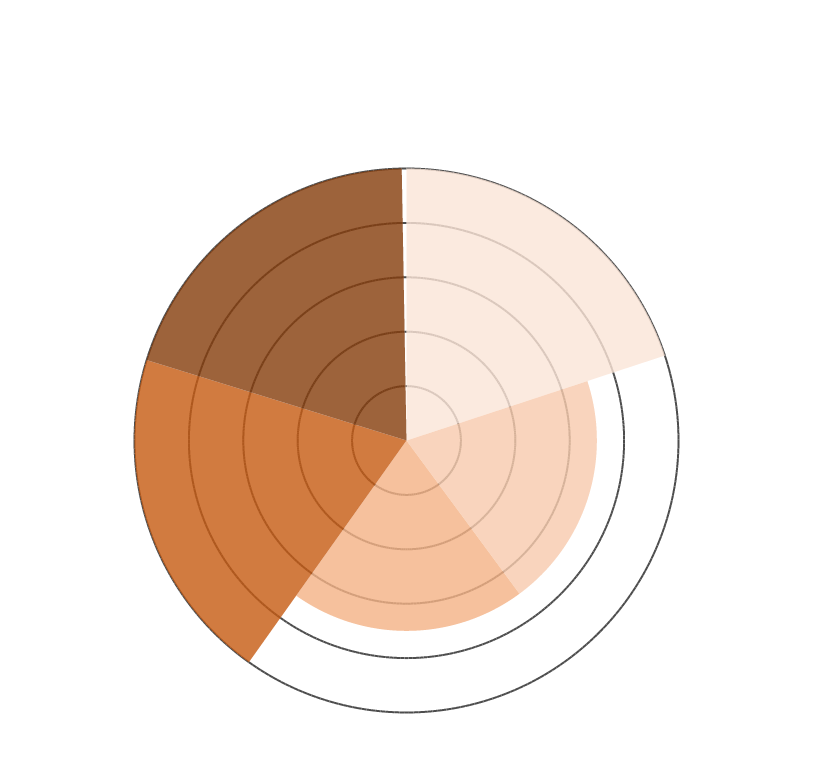
| Category | WKK / Biogasketel | Warmtevraag slibvergisting | Vollasturen WKK | Aquathermie? | Uitkoppeling gerealiseerd? |
|---|---|---|---|---|---|
| 0 | 10 | 0 | 0 | 0 | 0 |
| 1 | 10 | 0 | 0 | 0 | 0 |
| 2 | 10 | 0 | 0 | 0 | 0 |
| 3 | 10 | 0 | 0 | 0 | 0 |
| 4 | 10 | 0 | 0 | 0 | 0 |
| 5 | 10 | 0 | 0 | 0 | 0 |
| 6 | 10 | 0 | 0 | 0 | 0 |
| 7 | 10 | 0 | 0 | 0 | 0 |
| 8 | 10 | 0 | 0 | 0 | 0 |
| 9 | 10 | 0 | 0 | 0 | 0 |
| 10 | 10 | 0 | 0 | 0 | 0 |
| 11 | 10 | 0 | 0 | 0 | 0 |
| 12 | 10 | 0 | 0 | 0 | 0 |
| 13 | 10 | 0 | 0 | 0 | 0 |
| 14 | 10 | 0 | 0 | 0 | 0 |
| 15 | 10 | 0 | 0 | 0 | 0 |
| 16 | 10 | 0 | 0 | 0 | 0 |
| 17 | 10 | 0 | 0 | 0 | 0 |
| 18 | 10 | 0 | 0 | 0 | 0 |
| 19 | 10 | 0 | 0 | 0 | 0 |
| 20 | 10 | 0 | 0 | 0 | 0 |
| 21 | 10 | 0 | 0 | 0 | 0 |
| 22 | 10 | 0 | 0 | 0 | 0 |
| 23 | 10 | 0 | 0 | 0 | 0 |
| 24 | 10 | 0 | 0 | 0 | 0 |
| 25 | 10 | 0 | 0 | 0 | 0 |
| 26 | 10 | 0 | 0 | 0 | 0 |
| 27 | 10 | 0 | 0 | 0 | 0 |
| 28 | 10 | 0 | 0 | 0 | 0 |
| 29 | 10 | 0 | 0 | 0 | 0 |
| 30 | 10 | 0 | 0 | 0 | 0 |
| 31 | 10 | 0 | 0 | 0 | 0 |
| 32 | 10 | 0 | 0 | 0 | 0 |
| 33 | 10 | 0 | 0 | 0 | 0 |
| 34 | 10 | 0 | 0 | 0 | 0 |
| 35 | 10 | 0 | 0 | 0 | 0 |
| 36 | 10 | 0 | 0 | 0 | 0 |
| 37 | 10 | 0 | 0 | 0 | 0 |
| 38 | 10 | 0 | 0 | 0 | 0 |
| 39 | 10 | 0 | 0 | 0 | 0 |
| 40 | 10 | 0 | 0 | 0 | 0 |
| 41 | 10 | 0 | 0 | 0 | 0 |
| 42 | 10 | 0 | 0 | 0 | 0 |
| 43 | 10 | 0 | 0 | 0 | 0 |
| 44 | 10 | 0 | 0 | 0 | 0 |
| 45 | 10 | 0 | 0 | 0 | 0 |
| 46 | 10 | 0 | 0 | 0 | 0 |
| 47 | 10 | 0 | 0 | 0 | 0 |
| 48 | 10 | 0 | 0 | 0 | 0 |
| 49 | 10 | 0 | 0 | 0 | 0 |
| 50 | 10 | 0 | 0 | 0 | 0 |
| 51 | 10 | 0 | 0 | 0 | 0 |
| 52 | 10 | 0 | 0 | 0 | 0 |
| 53 | 10 | 0 | 0 | 0 | 0 |
| 54 | 10 | 0 | 0 | 0 | 0 |
| 55 | 10 | 0 | 0 | 0 | 0 |
| 56 | 10 | 0 | 0 | 0 | 0 |
| 57 | 10 | 0 | 0 | 0 | 0 |
| 58 | 10 | 0 | 0 | 0 | 0 |
| 59 | 10 | 0 | 0 | 0 | 0 |
| 60 | 10 | 0 | 0 | 0 | 0 |
| 61 | 10 | 0 | 0 | 0 | 0 |
| 62 | 10 | 0 | 0 | 0 | 0 |
| 63 | 10 | 0 | 0 | 0 | 0 |
| 64 | 10 | 0 | 0 | 0 | 0 |
| 65 | 10 | 0 | 0 | 0 | 0 |
| 66 | 10 | 0 | 0 | 0 | 0 |
| 67 | 10 | 0 | 0 | 0 | 0 |
| 68 | 10 | 0 | 0 | 0 | 0 |
| 69 | 10 | 0 | 0 | 0 | 0 |
| 70 | 10 | 0 | 0 | 0 | 0 |
| 71 | 10 | 0 | 0 | 0 | 0 |
| 72 | 10 | 7 | 0 | 0 | 0 |
| 73 | 0 | 7 | 0 | 0 | 0 |
| 74 | 0 | 7 | 0 | 0 | 0 |
| 75 | 0 | 7 | 0 | 0 | 0 |
| 76 | 0 | 7 | 0 | 0 | 0 |
| 77 | 0 | 7 | 0 | 0 | 0 |
| 78 | 0 | 7 | 0 | 0 | 0 |
| 79 | 0 | 7 | 0 | 0 | 0 |
| 80 | 0 | 7 | 0 | 0 | 0 |
| 81 | 0 | 7 | 0 | 0 | 0 |
| 82 | 0 | 7 | 0 | 0 | 0 |
| 83 | 0 | 7 | 0 | 0 | 0 |
| 84 | 0 | 7 | 0 | 0 | 0 |
| 85 | 0 | 7 | 0 | 0 | 0 |
| 86 | 0 | 7 | 0 | 0 | 0 |
| 87 | 0 | 7 | 0 | 0 | 0 |
| 88 | 0 | 7 | 0 | 0 | 0 |
| 89 | 0 | 7 | 0 | 0 | 0 |
| 90 | 0 | 7 | 0 | 0 | 0 |
| 91 | 0 | 7 | 0 | 0 | 0 |
| 92 | 0 | 7 | 0 | 0 | 0 |
| 93 | 0 | 7 | 0 | 0 | 0 |
| 94 | 0 | 7 | 0 | 0 | 0 |
| 95 | 0 | 7 | 0 | 0 | 0 |
| 96 | 0 | 7 | 0 | 0 | 0 |
| 97 | 0 | 7 | 0 | 0 | 0 |
| 98 | 0 | 7 | 0 | 0 | 0 |
| 99 | 0 | 7 | 0 | 0 | 0 |
| 100 | 0 | 7 | 0 | 0 | 0 |
| 101 | 0 | 7 | 0 | 0 | 0 |
| 102 | 0 | 7 | 0 | 0 | 0 |
| 103 | 0 | 7 | 0 | 0 | 0 |
| 104 | 0 | 7 | 0 | 0 | 0 |
| 105 | 0 | 7 | 0 | 0 | 0 |
| 106 | 0 | 7 | 0 | 0 | 0 |
| 107 | 0 | 7 | 0 | 0 | 0 |
| 108 | 0 | 7 | 0 | 0 | 0 |
| 109 | 0 | 7 | 0 | 0 | 0 |
| 110 | 0 | 7 | 0 | 0 | 0 |
| 111 | 0 | 7 | 0 | 0 | 0 |
| 112 | 0 | 7 | 0 | 0 | 0 |
| 113 | 0 | 7 | 0 | 0 | 0 |
| 114 | 0 | 7 | 0 | 0 | 0 |
| 115 | 0 | 7 | 0 | 0 | 0 |
| 116 | 0 | 7 | 0 | 0 | 0 |
| 117 | 0 | 7 | 0 | 0 | 0 |
| 118 | 0 | 7 | 0 | 0 | 0 |
| 119 | 0 | 7 | 0 | 0 | 0 |
| 120 | 0 | 7 | 0 | 0 | 0 |
| 121 | 0 | 7 | 0 | 0 | 0 |
| 122 | 0 | 7 | 0 | 0 | 0 |
| 123 | 0 | 7 | 0 | 0 | 0 |
| 124 | 0 | 7 | 0 | 0 | 0 |
| 125 | 0 | 7 | 0 | 0 | 0 |
| 126 | 0 | 7 | 0 | 0 | 0 |
| 127 | 0 | 7 | 0 | 0 | 0 |
| 128 | 0 | 7 | 0 | 0 | 0 |
| 129 | 0 | 7 | 0 | 0 | 0 |
| 130 | 0 | 7 | 0 | 0 | 0 |
| 131 | 0 | 7 | 0 | 0 | 0 |
| 132 | 0 | 7 | 0 | 0 | 0 |
| 133 | 0 | 7 | 0 | 0 | 0 |
| 134 | 0 | 7 | 0 | 0 | 0 |
| 135 | 0 | 7 | 0 | 0 | 0 |
| 136 | 0 | 7 | 0 | 0 | 0 |
| 137 | 0 | 7 | 0 | 0 | 0 |
| 138 | 0 | 7 | 0 | 0 | 0 |
| 139 | 0 | 7 | 0 | 0 | 0 |
| 140 | 0 | 7 | 0 | 0 | 0 |
| 141 | 0 | 7 | 0 | 0 | 0 |
| 142 | 0 | 7 | 0 | 0 | 0 |
| 143 | 0 | 7 | 0 | 0 | 0 |
| 144 | 0 | 7 | 7 | 0 | 0 |
| 145 | 0 | 0 | 7 | 0 | 0 |
| 146 | 0 | 0 | 7 | 0 | 0 |
| 147 | 0 | 0 | 7 | 0 | 0 |
| 148 | 0 | 0 | 7 | 0 | 0 |
| 149 | 0 | 0 | 7 | 0 | 0 |
| 150 | 0 | 0 | 7 | 0 | 0 |
| 151 | 0 | 0 | 7 | 0 | 0 |
| 152 | 0 | 0 | 7 | 0 | 0 |
| 153 | 0 | 0 | 7 | 0 | 0 |
| 154 | 0 | 0 | 7 | 0 | 0 |
| 155 | 0 | 0 | 7 | 0 | 0 |
| 156 | 0 | 0 | 7 | 0 | 0 |
| 157 | 0 | 0 | 7 | 0 | 0 |
| 158 | 0 | 0 | 7 | 0 | 0 |
| 159 | 0 | 0 | 7 | 0 | 0 |
| 160 | 0 | 0 | 7 | 0 | 0 |
| 161 | 0 | 0 | 7 | 0 | 0 |
| 162 | 0 | 0 | 7 | 0 | 0 |
| 163 | 0 | 0 | 7 | 0 | 0 |
| 164 | 0 | 0 | 7 | 0 | 0 |
| 165 | 0 | 0 | 7 | 0 | 0 |
| 166 | 0 | 0 | 7 | 0 | 0 |
| 167 | 0 | 0 | 7 | 0 | 0 |
| 168 | 0 | 0 | 7 | 0 | 0 |
| 169 | 0 | 0 | 7 | 0 | 0 |
| 170 | 0 | 0 | 7 | 0 | 0 |
| 171 | 0 | 0 | 7 | 0 | 0 |
| 172 | 0 | 0 | 7 | 0 | 0 |
| 173 | 0 | 0 | 7 | 0 | 0 |
| 174 | 0 | 0 | 7 | 0 | 0 |
| 175 | 0 | 0 | 7 | 0 | 0 |
| 176 | 0 | 0 | 7 | 0 | 0 |
| 177 | 0 | 0 | 7 | 0 | 0 |
| 178 | 0 | 0 | 7 | 0 | 0 |
| 179 | 0 | 0 | 7 | 0 | 0 |
| 180 | 0 | 0 | 7 | 0 | 0 |
| 181 | 0 | 0 | 7 | 0 | 0 |
| 182 | 0 | 0 | 7 | 0 | 0 |
| 183 | 0 | 0 | 7 | 0 | 0 |
| 184 | 0 | 0 | 7 | 0 | 0 |
| 185 | 0 | 0 | 7 | 0 | 0 |
| 186 | 0 | 0 | 7 | 0 | 0 |
| 187 | 0 | 0 | 7 | 0 | 0 |
| 188 | 0 | 0 | 7 | 0 | 0 |
| 189 | 0 | 0 | 7 | 0 | 0 |
| 190 | 0 | 0 | 7 | 0 | 0 |
| 191 | 0 | 0 | 7 | 0 | 0 |
| 192 | 0 | 0 | 7 | 0 | 0 |
| 193 | 0 | 0 | 7 | 0 | 0 |
| 194 | 0 | 0 | 7 | 0 | 0 |
| 195 | 0 | 0 | 7 | 0 | 0 |
| 196 | 0 | 0 | 7 | 0 | 0 |
| 197 | 0 | 0 | 7 | 0 | 0 |
| 198 | 0 | 0 | 7 | 0 | 0 |
| 199 | 0 | 0 | 7 | 0 | 0 |
| 200 | 0 | 0 | 7 | 0 | 0 |
| 201 | 0 | 0 | 7 | 0 | 0 |
| 202 | 0 | 0 | 7 | 0 | 0 |
| 203 | 0 | 0 | 7 | 0 | 0 |
| 204 | 0 | 0 | 7 | 0 | 0 |
| 205 | 0 | 0 | 7 | 0 | 0 |
| 206 | 0 | 0 | 7 | 0 | 0 |
| 207 | 0 | 0 | 7 | 0 | 0 |
| 208 | 0 | 0 | 7 | 0 | 0 |
| 209 | 0 | 0 | 7 | 0 | 0 |
| 210 | 0 | 0 | 7 | 0 | 0 |
| 211 | 0 | 0 | 7 | 0 | 0 |
| 212 | 0 | 0 | 7 | 0 | 0 |
| 213 | 0 | 0 | 7 | 0 | 0 |
| 214 | 0 | 0 | 7 | 0 | 0 |
| 215 | 0 | 0 | 7 | 0 | 0 |
| 216 | 0 | 0 | 7 | 10 | 0 |
| 217 | 0 | 0 | 0 | 10 | 0 |
| 218 | 0 | 0 | 0 | 10 | 0 |
| 219 | 0 | 0 | 0 | 10 | 0 |
| 220 | 0 | 0 | 0 | 10 | 0 |
| 221 | 0 | 0 | 0 | 10 | 0 |
| 222 | 0 | 0 | 0 | 10 | 0 |
| 223 | 0 | 0 | 0 | 10 | 0 |
| 224 | 0 | 0 | 0 | 10 | 0 |
| 225 | 0 | 0 | 0 | 10 | 0 |
| 226 | 0 | 0 | 0 | 10 | 0 |
| 227 | 0 | 0 | 0 | 10 | 0 |
| 228 | 0 | 0 | 0 | 10 | 0 |
| 229 | 0 | 0 | 0 | 10 | 0 |
| 230 | 0 | 0 | 0 | 10 | 0 |
| 231 | 0 | 0 | 0 | 10 | 0 |
| 232 | 0 | 0 | 0 | 10 | 0 |
| 233 | 0 | 0 | 0 | 10 | 0 |
| 234 | 0 | 0 | 0 | 10 | 0 |
| 235 | 0 | 0 | 0 | 10 | 0 |
| 236 | 0 | 0 | 0 | 10 | 0 |
| 237 | 0 | 0 | 0 | 10 | 0 |
| 238 | 0 | 0 | 0 | 10 | 0 |
| 239 | 0 | 0 | 0 | 10 | 0 |
| 240 | 0 | 0 | 0 | 10 | 0 |
| 241 | 0 | 0 | 0 | 10 | 0 |
| 242 | 0 | 0 | 0 | 10 | 0 |
| 243 | 0 | 0 | 0 | 10 | 0 |
| 244 | 0 | 0 | 0 | 10 | 0 |
| 245 | 0 | 0 | 0 | 10 | 0 |
| 246 | 0 | 0 | 0 | 10 | 0 |
| 247 | 0 | 0 | 0 | 10 | 0 |
| 248 | 0 | 0 | 0 | 10 | 0 |
| 249 | 0 | 0 | 0 | 10 | 0 |
| 250 | 0 | 0 | 0 | 10 | 0 |
| 251 | 0 | 0 | 0 | 10 | 0 |
| 252 | 0 | 0 | 0 | 10 | 0 |
| 253 | 0 | 0 | 0 | 10 | 0 |
| 254 | 0 | 0 | 0 | 10 | 0 |
| 255 | 0 | 0 | 0 | 10 | 0 |
| 256 | 0 | 0 | 0 | 10 | 0 |
| 257 | 0 | 0 | 0 | 10 | 0 |
| 258 | 0 | 0 | 0 | 10 | 0 |
| 259 | 0 | 0 | 0 | 10 | 0 |
| 260 | 0 | 0 | 0 | 10 | 0 |
| 261 | 0 | 0 | 0 | 10 | 0 |
| 262 | 0 | 0 | 0 | 10 | 0 |
| 263 | 0 | 0 | 0 | 10 | 0 |
| 264 | 0 | 0 | 0 | 10 | 0 |
| 265 | 0 | 0 | 0 | 10 | 0 |
| 266 | 0 | 0 | 0 | 10 | 0 |
| 267 | 0 | 0 | 0 | 10 | 0 |
| 268 | 0 | 0 | 0 | 10 | 0 |
| 269 | 0 | 0 | 0 | 10 | 0 |
| 270 | 0 | 0 | 0 | 10 | 0 |
| 271 | 0 | 0 | 0 | 10 | 0 |
| 272 | 0 | 0 | 0 | 10 | 0 |
| 273 | 0 | 0 | 0 | 10 | 0 |
| 274 | 0 | 0 | 0 | 10 | 0 |
| 275 | 0 | 0 | 0 | 10 | 0 |
| 276 | 0 | 0 | 0 | 10 | 0 |
| 277 | 0 | 0 | 0 | 10 | 0 |
| 278 | 0 | 0 | 0 | 10 | 0 |
| 279 | 0 | 0 | 0 | 10 | 0 |
| 280 | 0 | 0 | 0 | 10 | 0 |
| 281 | 0 | 0 | 0 | 10 | 0 |
| 282 | 0 | 0 | 0 | 10 | 0 |
| 283 | 0 | 0 | 0 | 10 | 0 |
| 284 | 0 | 0 | 0 | 10 | 0 |
| 285 | 0 | 0 | 0 | 10 | 0 |
| 286 | 0 | 0 | 0 | 10 | 0 |
| 287 | 0 | 0 | 0 | 10 | 0 |
| 288 | 0 | 0 | 0 | 10 | 0 |
| 289 | 0 | 0 | 0 | 0 | 0 |
| 290 | 0 | 0 | 0 | 0 | 0 |
| 291 | 0 | 0 | 0 | 0 | 0 |
| 292 | 0 | 0 | 0 | 0 | 0 |
| 293 | 0 | 0 | 0 | 0 | 0 |
| 294 | 0 | 0 | 0 | 0 | 0 |
| 295 | 0 | 0 | 0 | 0 | 0 |
| 296 | 0 | 0 | 0 | 0 | 0 |
| 297 | 0 | 0 | 0 | 0 | 0 |
| 298 | 0 | 0 | 0 | 0 | 0 |
| 299 | 0 | 0 | 0 | 0 | 0 |
| 300 | 0 | 0 | 0 | 0 | 0 |
| 301 | 0 | 0 | 0 | 0 | 0 |
| 302 | 0 | 0 | 0 | 0 | 0 |
| 303 | 0 | 0 | 0 | 0 | 0 |
| 304 | 0 | 0 | 0 | 0 | 0 |
| 305 | 0 | 0 | 0 | 0 | 0 |
| 306 | 0 | 0 | 0 | 0 | 0 |
| 307 | 0 | 0 | 0 | 0 | 0 |
| 308 | 0 | 0 | 0 | 0 | 0 |
| 309 | 0 | 0 | 0 | 0 | 0 |
| 310 | 0 | 0 | 0 | 0 | 0 |
| 311 | 0 | 0 | 0 | 0 | 0 |
| 312 | 0 | 0 | 0 | 0 | 0 |
| 313 | 0 | 0 | 0 | 0 | 0 |
| 314 | 0 | 0 | 0 | 0 | 0 |
| 315 | 0 | 0 | 0 | 0 | 0 |
| 316 | 0 | 0 | 0 | 0 | 0 |
| 317 | 0 | 0 | 0 | 0 | 0 |
| 318 | 0 | 0 | 0 | 0 | 0 |
| 319 | 0 | 0 | 0 | 0 | 0 |
| 320 | 0 | 0 | 0 | 0 | 0 |
| 321 | 0 | 0 | 0 | 0 | 0 |
| 322 | 0 | 0 | 0 | 0 | 0 |
| 323 | 0 | 0 | 0 | 0 | 0 |
| 324 | 0 | 0 | 0 | 0 | 0 |
| 325 | 0 | 0 | 0 | 0 | 0 |
| 326 | 0 | 0 | 0 | 0 | 0 |
| 327 | 0 | 0 | 0 | 0 | 0 |
| 328 | 0 | 0 | 0 | 0 | 0 |
| 329 | 0 | 0 | 0 | 0 | 0 |
| 330 | 0 | 0 | 0 | 0 | 0 |
| 331 | 0 | 0 | 0 | 0 | 0 |
| 332 | 0 | 0 | 0 | 0 | 0 |
| 333 | 0 | 0 | 0 | 0 | 0 |
| 334 | 0 | 0 | 0 | 0 | 0 |
| 335 | 0 | 0 | 0 | 0 | 0 |
| 336 | 0 | 0 | 0 | 0 | 0 |
| 337 | 0 | 0 | 0 | 0 | 0 |
| 338 | 0 | 0 | 0 | 0 | 0 |
| 339 | 0 | 0 | 0 | 0 | 0 |
| 340 | 0 | 0 | 0 | 0 | 0 |
| 341 | 0 | 0 | 0 | 0 | 0 |
| 342 | 0 | 0 | 0 | 0 | 0 |
| 343 | 0 | 0 | 0 | 0 | 0 |
| 344 | 0 | 0 | 0 | 0 | 0 |
| 345 | 0 | 0 | 0 | 0 | 0 |
| 346 | 0 | 0 | 0 | 0 | 0 |
| 347 | 0 | 0 | 0 | 0 | 0 |
| 348 | 0 | 0 | 0 | 0 | 0 |
| 349 | 0 | 0 | 0 | 0 | 0 |
| 350 | 0 | 0 | 0 | 0 | 0 |
| 351 | 0 | 0 | 0 | 0 | 0 |
| 352 | 0 | 0 | 0 | 0 | 0 |
| 353 | 0 | 0 | 0 | 0 | 0 |
| 354 | 0 | 0 | 0 | 0 | 0 |
| 355 | 0 | 0 | 0 | 0 | 0 |
| 356 | 0 | 0 | 0 | 0 | 0 |
| 357 | 0 | 0 | 0 | 0 | 0 |
| 358 | 0 | 0 | 0 | 0 | 0 |
| 359 | 0 | 0 | 0 | 0 | 0 |
| 360 | 0 | 0 | 0 | 0 | 10 |